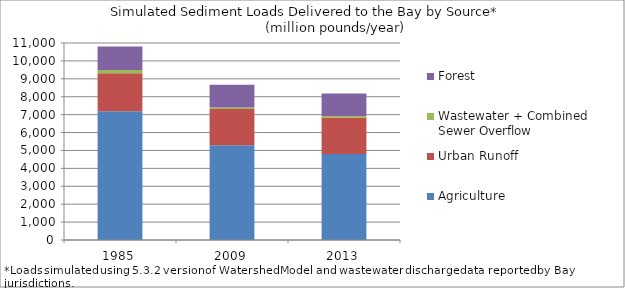
| Category | Agriculture | Urban Runoff | Wastewater + Combined Sewer Overflow | Forest |
|---|---|---|---|---|
| 1985.0 | 7189.988 | 2127.373 | 175.916 | 1305.108 |
| 2009.0 | 5295.442 | 2018.911 | 87.099 | 1273.8 |
| 2013.0 | 4799.865 | 2033.976 | 86.017 | 1257.918 |